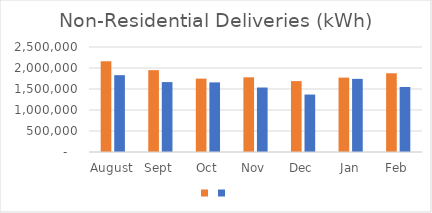
| Category | Series 1 | Series 0 |
|---|---|---|
| August | 2157982 | 1829758 |
| Sept | 1948950 | 1665239 |
| Oct | 1746850 | 1657467 |
| Nov | 1778480 | 1535448 |
| Dec | 1688051 | 1367905 |
| Jan | 1770828 | 1741151 |
| Feb | 1874770 | 1548063 |